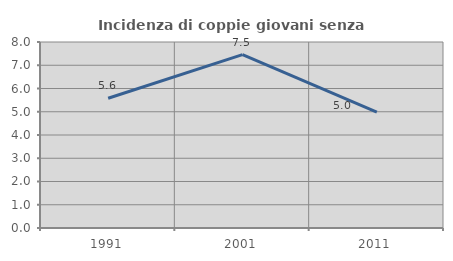
| Category | Incidenza di coppie giovani senza figli |
|---|---|
| 1991.0 | 5.582 |
| 2001.0 | 7.457 |
| 2011.0 | 4.981 |